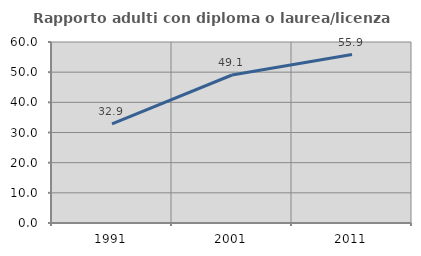
| Category | Rapporto adulti con diploma o laurea/licenza media  |
|---|---|
| 1991.0 | 32.857 |
| 2001.0 | 49.057 |
| 2011.0 | 55.856 |